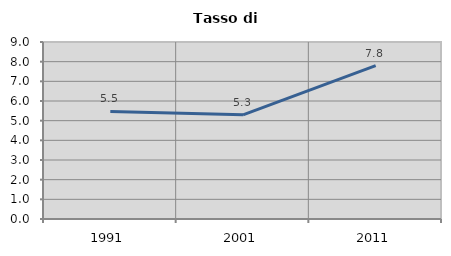
| Category | Tasso di disoccupazione   |
|---|---|
| 1991.0 | 5.466 |
| 2001.0 | 5.298 |
| 2011.0 | 7.803 |